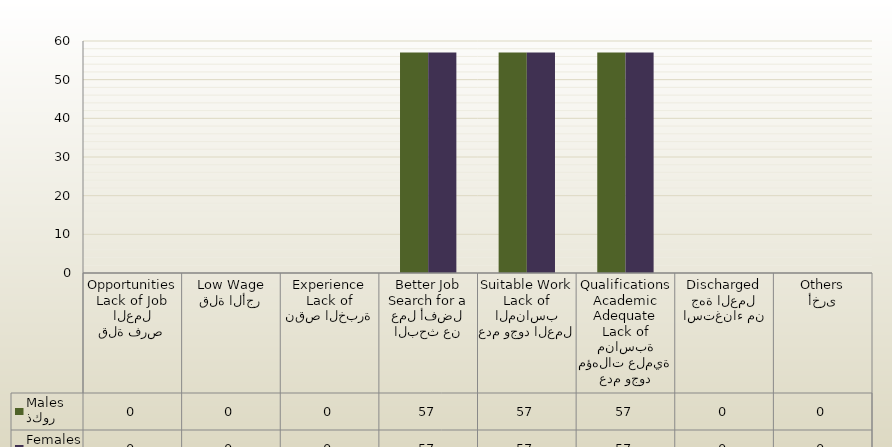
| Category | ذكور
Males | اناث
Females |
|---|---|---|
| قلة فرص العمل
Lack of Job Opportunities | 0 | 0 |
| قلة الأجر
Low Wage | 0 | 0 |
| نقص الخبرة
Lack of Experience | 0 | 0 |
| البحث عن عمل أفضل
Search for a Better Job | 57 | 57 |
| عدم وجود العمل المناسب
Lack of Suitable Work | 57 | 57 |
| عدم وجود مؤهلات علمية مناسبة
Lack of Adequate Academic Qualifications | 57 | 57 |
| استغناء من جهة العمل
Discharged | 0 | 0 |
| أخرى
Others | 0 | 0 |